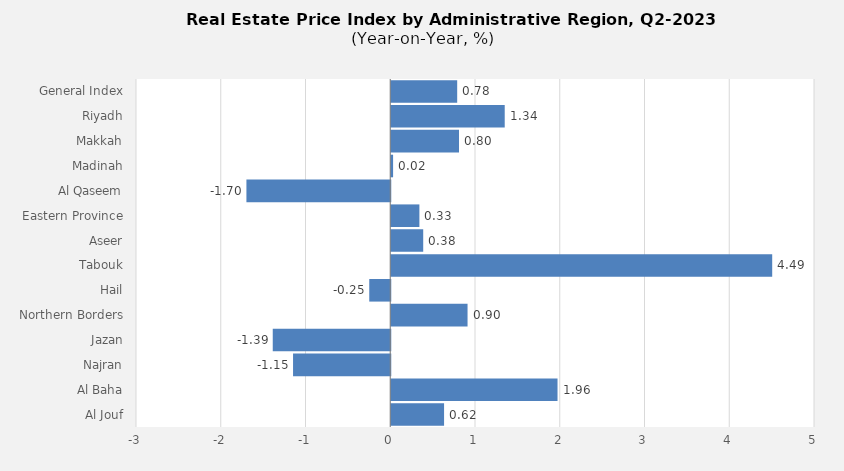
| Category | 2023 |
|---|---|
| General Index | 0.778 |
| Riyadh | 1.339 |
| Makkah | 0.799 |
| Madinah | 0.022 |
| Al Qaseem | -1.697 |
| Eastern Province | 0.332 |
| Aseer | 0.377 |
| Tabouk | 4.495 |
| Hail | -0.248 |
| Northern Borders | 0.9 |
| Jazan | -1.386 |
| Najran | -1.147 |
| Al Baha | 1.962 |
| Al Jouf | 0.623 |